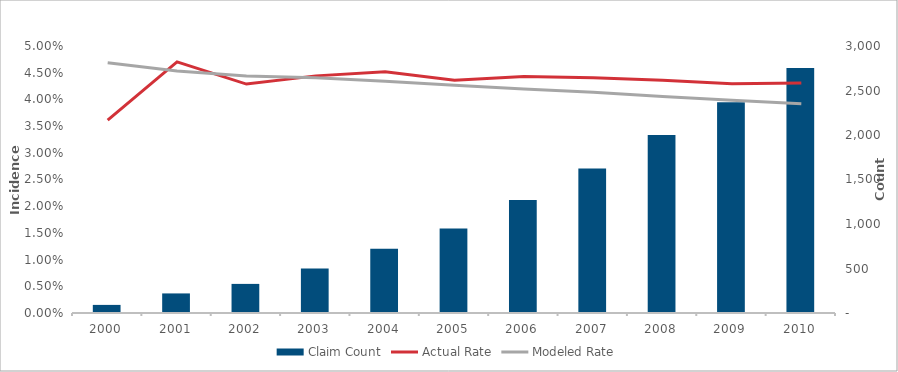
| Category | Claim Count |
|---|---|
| 2000.0 | 91 |
| 2001.0 | 220 |
| 2002.0 | 327 |
| 2003.0 | 499 |
| 2004.0 | 722 |
| 2005.0 | 950 |
| 2006.0 | 1271 |
| 2007.0 | 1624 |
| 2008.0 | 1999 |
| 2009.0 | 2367 |
| 2010.0 | 2754 |